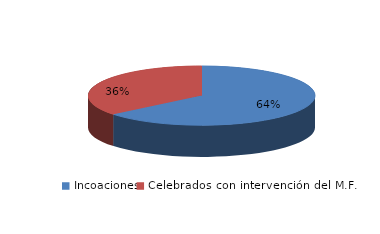
| Category | Series 0 |
|---|---|
| Incoaciones | 2038 |
| Celebrados con intervención del M.F. | 1141 |